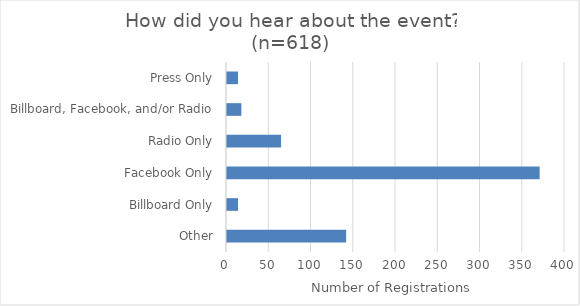
| Category | Series 0 |
|---|---|
| Other | 141 |
| Billboard Only | 13 |
| Facebook Only | 370 |
| Radio Only | 64 |
| Billboard, Facebook, and/or Radio | 17 |
| Press Only | 13 |